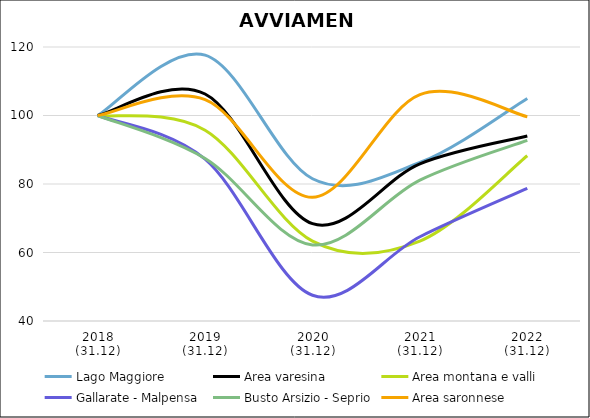
| Category | Lago Maggiore | Area varesina | Area montana e valli | Gallarate - Malpensa | Busto Arsizio - Seprio | Area saronnese |
|---|---|---|---|---|---|---|
| 2018
(31.12) | 100 | 100 | 100 | 100 | 100 | 100 |
| 2019
(31.12) | 117.618 | 106.267 | 95.702 | 87.249 | 87.47 | 104.622 |
| 2020
(31.12) | 81.531 | 68.41 | 63.338 | 47.508 | 62.218 | 76.12 |
| 2021
(31.12) | 86.27 | 85.898 | 63.338 | 64.595 | 81.133 | 106.092 |
| 2022
(31.12) | 104.982 | 94.036 | 88.243 | 78.706 | 92.751 | 99.65 |